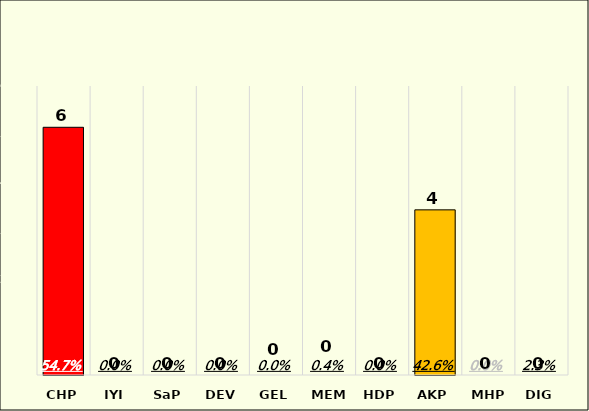
| Category | Oy Oranı |
|---|---|
| CHP | 0.547 |
| IYI | 0 |
| SaP | 0 |
| DEV | 0 |
| GEL | 0 |
| MEM | 0.004 |
| HDP | 0 |
| AKP | 0.426 |
| MHP | 0 |
| DIG | 0.023 |